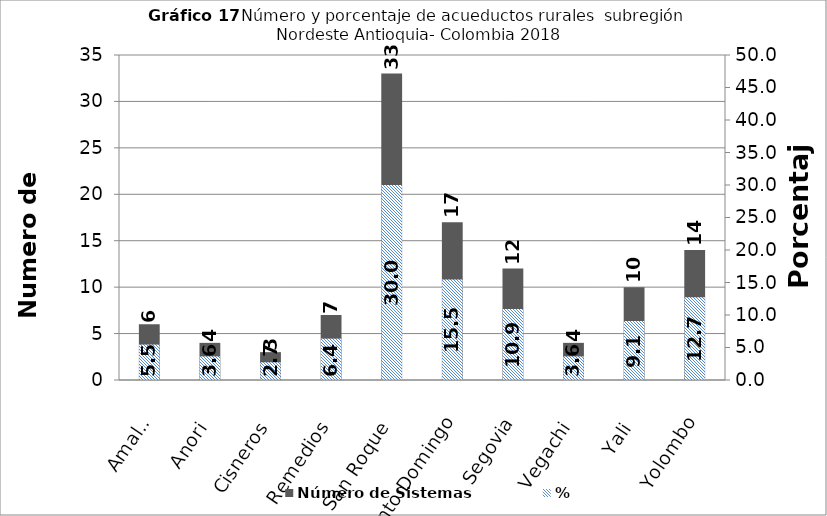
| Category | Número de Sistemas |
|---|---|
| Amalfi | 6 |
| Anori | 4 |
| Cisneros | 3 |
| Remedios | 7 |
| San Roque | 33 |
| Santo Domingo | 17 |
| Segovia | 12 |
| Vegachi | 4 |
| Yali | 10 |
| Yolombo | 14 |